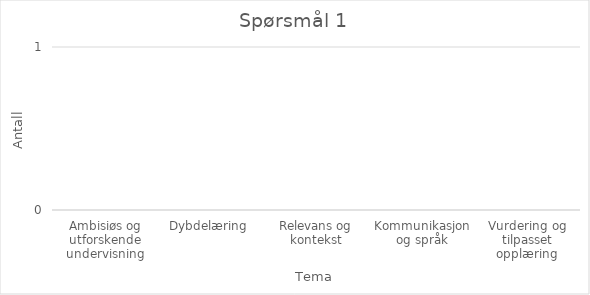
| Category | Antall svar |
|---|---|
| Ambisiøs og utforskende undervisning | 0 |
| Dybdelæring | 0 |
| Relevans og kontekst | 0 |
| Kommunikasjon og språk | 0 |
| Vurdering og tilpasset opplæring | 0 |